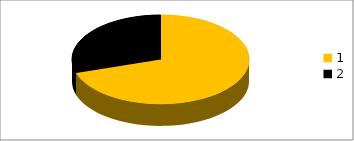
| Category | Series 0 |
|---|---|
| 0 | 7 |
| 1 | 3 |